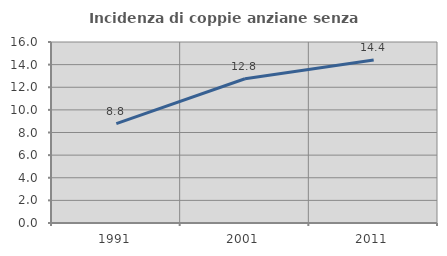
| Category | Incidenza di coppie anziane senza figli  |
|---|---|
| 1991.0 | 8.79 |
| 2001.0 | 12.754 |
| 2011.0 | 14.413 |